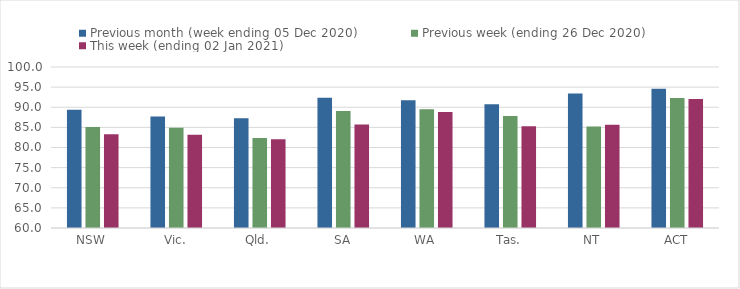
| Category | Previous month (week ending 05 Dec 2020) | Previous week (ending 26 Dec 2020) | This week (ending 02 Jan 2021) |
|---|---|---|---|
| NSW | 89.35 | 85.07 | 83.3 |
| Vic. | 87.72 | 84.9 | 83.15 |
| Qld. | 87.27 | 82.38 | 82.06 |
| SA | 92.36 | 89.06 | 85.73 |
| WA | 91.74 | 89.5 | 88.82 |
| Tas. | 90.75 | 87.85 | 85.29 |
| NT | 93.42 | 85.19 | 85.63 |
| ACT | 94.61 | 92.28 | 92.08 |